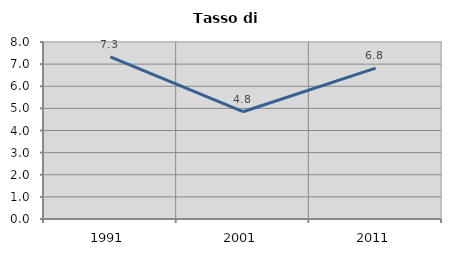
| Category | Tasso di disoccupazione   |
|---|---|
| 1991.0 | 7.325 |
| 2001.0 | 4.848 |
| 2011.0 | 6.816 |